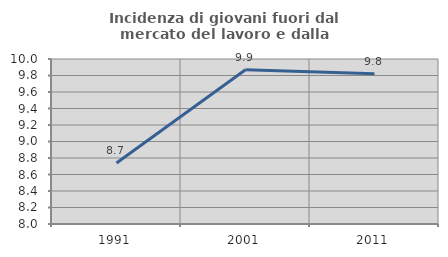
| Category | Incidenza di giovani fuori dal mercato del lavoro e dalla formazione  |
|---|---|
| 1991.0 | 8.738 |
| 2001.0 | 9.869 |
| 2011.0 | 9.82 |